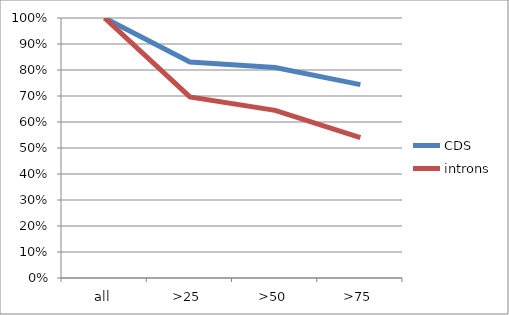
| Category | CDS | introns |
|---|---|---|
| all | 1 | 1 |
| >25 | 0.831 | 0.697 |
| >50 | 0.81 | 0.645 |
| >75 | 0.744 | 0.54 |